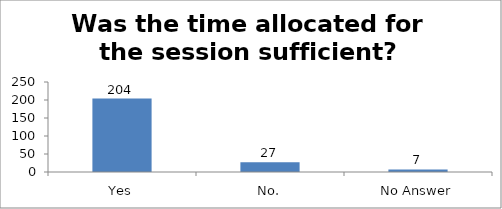
| Category | Was the time allocated for the session sufficient? |
|---|---|
| Yes | 204 |
| No. | 27 |
| No Answer | 7 |